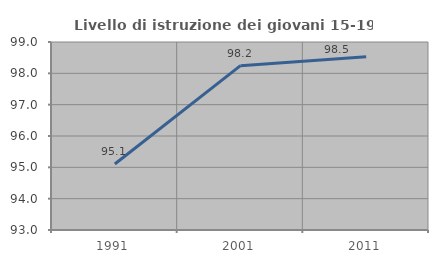
| Category | Livello di istruzione dei giovani 15-19 anni |
|---|---|
| 1991.0 | 95.105 |
| 2001.0 | 98.246 |
| 2011.0 | 98.529 |